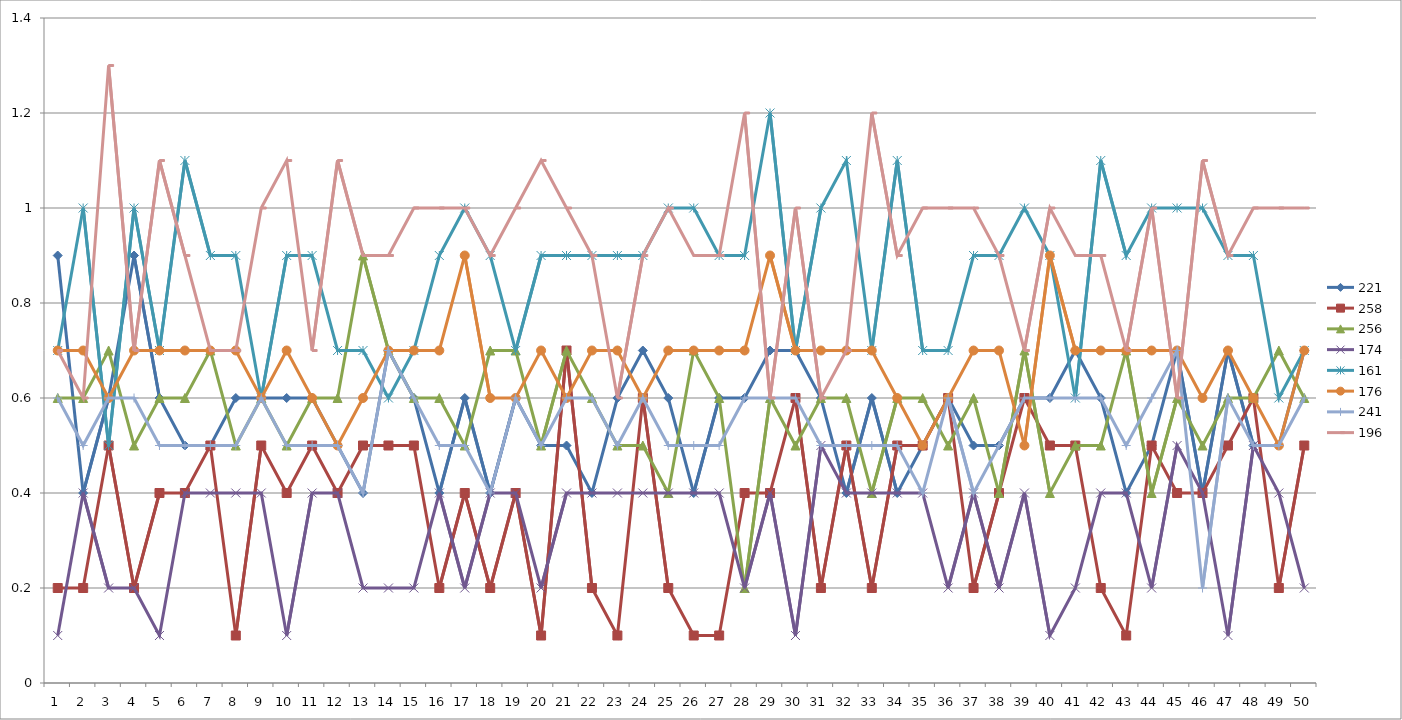
| Category | 221 | 258 | 256 | 174 | 161 | 176 | 241 | 196 |
|---|---|---|---|---|---|---|---|---|
| 0 | 0.9 | 0.2 | 0.6 | 0.1 | 0.7 | 0.7 | 0.6 | 0.7 |
| 1 | 0.4 | 0.2 | 0.6 | 0.4 | 1 | 0.7 | 0.5 | 0.6 |
| 2 | 0.6 | 0.5 | 0.7 | 0.2 | 0.5 | 0.6 | 0.6 | 1.3 |
| 3 | 0.9 | 0.2 | 0.5 | 0.2 | 1 | 0.7 | 0.6 | 0.7 |
| 4 | 0.6 | 0.4 | 0.6 | 0.1 | 0.7 | 0.7 | 0.5 | 1.1 |
| 5 | 0.5 | 0.4 | 0.6 | 0.4 | 1.1 | 0.7 | 0.5 | 0.9 |
| 6 | 0.5 | 0.5 | 0.7 | 0.4 | 0.9 | 0.7 | 0.5 | 0.7 |
| 7 | 0.6 | 0.1 | 0.5 | 0.4 | 0.9 | 0.7 | 0.5 | 0.7 |
| 8 | 0.6 | 0.5 | 0.6 | 0.4 | 0.6 | 0.6 | 0.6 | 1 |
| 9 | 0.6 | 0.4 | 0.5 | 0.1 | 0.9 | 0.7 | 0.5 | 1.1 |
| 10 | 0.6 | 0.5 | 0.6 | 0.4 | 0.9 | 0.6 | 0.5 | 0.7 |
| 11 | 0.5 | 0.4 | 0.6 | 0.4 | 0.7 | 0.5 | 0.5 | 1.1 |
| 12 | 0.4 | 0.5 | 0.9 | 0.2 | 0.7 | 0.6 | 0.4 | 0.9 |
| 13 | 0.7 | 0.5 | 0.7 | 0.2 | 0.6 | 0.7 | 0.7 | 0.9 |
| 14 | 0.6 | 0.5 | 0.6 | 0.2 | 0.7 | 0.7 | 0.6 | 1 |
| 15 | 0.4 | 0.2 | 0.6 | 0.4 | 0.9 | 0.7 | 0.5 | 1 |
| 16 | 0.6 | 0.4 | 0.5 | 0.2 | 1 | 0.9 | 0.5 | 1 |
| 17 | 0.4 | 0.2 | 0.7 | 0.4 | 0.9 | 0.6 | 0.4 | 0.9 |
| 18 | 0.6 | 0.4 | 0.7 | 0.4 | 0.7 | 0.6 | 0.6 | 1 |
| 19 | 0.5 | 0.1 | 0.5 | 0.2 | 0.9 | 0.7 | 0.5 | 1.1 |
| 20 | 0.5 | 0.7 | 0.7 | 0.4 | 0.9 | 0.6 | 0.6 | 1 |
| 21 | 0.4 | 0.2 | 0.6 | 0.4 | 0.9 | 0.7 | 0.6 | 0.9 |
| 22 | 0.6 | 0.1 | 0.5 | 0.4 | 0.9 | 0.7 | 0.5 | 0.6 |
| 23 | 0.7 | 0.6 | 0.5 | 0.4 | 0.9 | 0.6 | 0.6 | 0.9 |
| 24 | 0.6 | 0.2 | 0.4 | 0.4 | 1 | 0.7 | 0.5 | 1 |
| 25 | 0.4 | 0.1 | 0.7 | 0.4 | 1 | 0.7 | 0.5 | 0.9 |
| 26 | 0.6 | 0.1 | 0.6 | 0.4 | 0.9 | 0.7 | 0.5 | 0.9 |
| 27 | 0.6 | 0.4 | 0.2 | 0.2 | 0.9 | 0.7 | 0.6 | 1.2 |
| 28 | 0.7 | 0.4 | 0.6 | 0.4 | 1.2 | 0.9 | 0.6 | 0.6 |
| 29 | 0.7 | 0.6 | 0.5 | 0.1 | 0.7 | 0.7 | 0.6 | 1 |
| 30 | 0.6 | 0.2 | 0.6 | 0.5 | 1 | 0.7 | 0.5 | 0.6 |
| 31 | 0.4 | 0.5 | 0.6 | 0.4 | 1.1 | 0.7 | 0.5 | 0.7 |
| 32 | 0.6 | 0.2 | 0.4 | 0.4 | 0.7 | 0.7 | 0.5 | 1.2 |
| 33 | 0.4 | 0.5 | 0.6 | 0.4 | 1.1 | 0.6 | 0.5 | 0.9 |
| 34 | 0.5 | 0.5 | 0.6 | 0.4 | 0.7 | 0.5 | 0.4 | 1 |
| 35 | 0.6 | 0.6 | 0.5 | 0.2 | 0.7 | 0.6 | 0.6 | 1 |
| 36 | 0.5 | 0.2 | 0.6 | 0.4 | 0.9 | 0.7 | 0.4 | 1 |
| 37 | 0.5 | 0.4 | 0.4 | 0.2 | 0.9 | 0.7 | 0.5 | 0.9 |
| 38 | 0.6 | 0.6 | 0.7 | 0.4 | 1 | 0.5 | 0.6 | 0.7 |
| 39 | 0.6 | 0.5 | 0.4 | 0.1 | 0.9 | 0.9 | 0.6 | 1 |
| 40 | 0.7 | 0.5 | 0.5 | 0.2 | 0.6 | 0.7 | 0.6 | 0.9 |
| 41 | 0.6 | 0.2 | 0.5 | 0.4 | 1.1 | 0.7 | 0.6 | 0.9 |
| 42 | 0.4 | 0.1 | 0.7 | 0.4 | 0.9 | 0.7 | 0.5 | 0.7 |
| 43 | 0.5 | 0.5 | 0.4 | 0.2 | 1 | 0.7 | 0.6 | 1 |
| 44 | 0.7 | 0.4 | 0.6 | 0.5 | 1 | 0.7 | 0.7 | 0.6 |
| 45 | 0.4 | 0.4 | 0.5 | 0.4 | 1 | 0.6 | 0.2 | 1.1 |
| 46 | 0.7 | 0.5 | 0.6 | 0.1 | 0.9 | 0.7 | 0.6 | 0.9 |
| 47 | 0.5 | 0.6 | 0.6 | 0.5 | 0.9 | 0.6 | 0.5 | 1 |
| 48 | 0.5 | 0.2 | 0.7 | 0.4 | 0.6 | 0.5 | 0.5 | 1 |
| 49 | 0.7 | 0.5 | 0.6 | 0.2 | 0.7 | 0.7 | 0.6 | 1 |